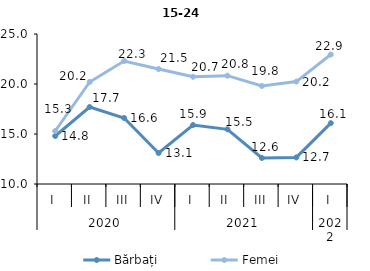
| Category | Bărbați | Femei |
|---|---|---|
| 0 | 14.8 | 15.3 |
| 1 | 17.7 | 20.2 |
| 2 | 16.6 | 22.3 |
| 3 | 13.1 | 21.5 |
| 4 | 15.899 | 20.718 |
| 5 | 15.467 | 20.834 |
| 6 | 12.6 | 19.8 |
| 7 | 12.657 | 20.243 |
| 8 | 16.088 | 22.949 |